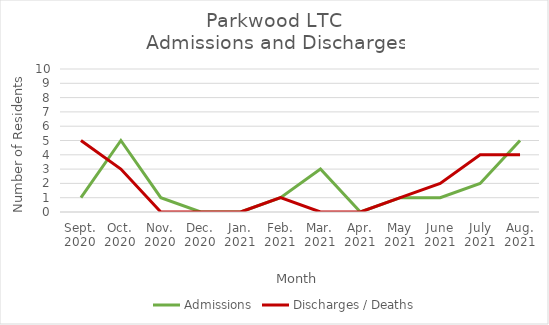
| Category | Admissions | Discharges / Deaths |
|---|---|---|
| Sept.
2020 | 1 | 5 |
| Oct.
2020 | 5 | 3 |
| Nov.
2020 | 1 | 0 |
| Dec.
2020 | 0 | 0 |
| Jan.
2021 | 0 | 0 |
| Feb.
2021 | 1 | 1 |
| Mar.
2021 | 3 | 0 |
| Apr.
2021 | 0 | 0 |
| May
2021 | 1 | 1 |
| June
2021 | 1 | 2 |
| July
2021 | 2 | 4 |
| Aug.
2021 | 5 | 4 |